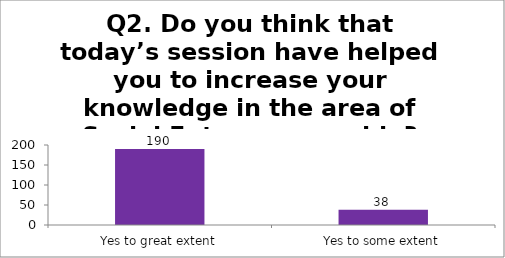
| Category | Q2. Do you think that today’s session have helped you to increase your knowledge in the area of Social Entrepreneurship? |
|---|---|
| Yes to great extent | 190 |
| Yes to some extent | 38 |